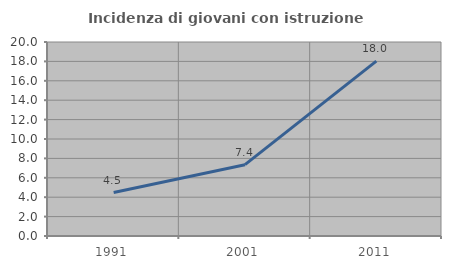
| Category | Incidenza di giovani con istruzione universitaria |
|---|---|
| 1991.0 | 4.478 |
| 2001.0 | 7.353 |
| 2011.0 | 18.033 |